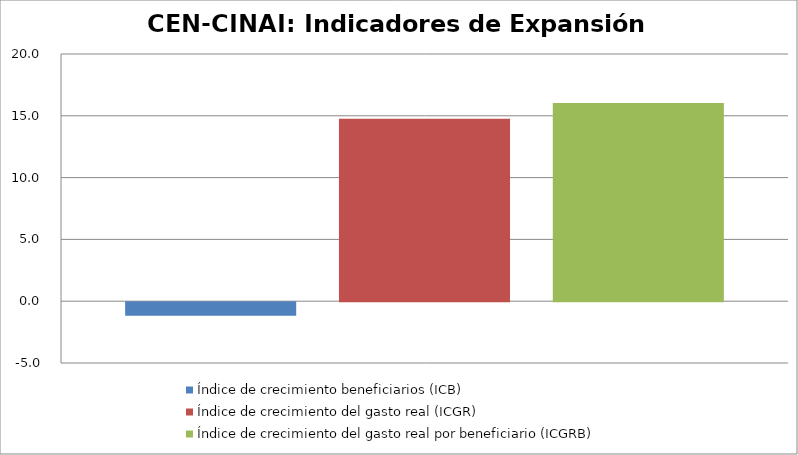
| Category | Índice de crecimiento beneficiarios (ICB)  | Índice de crecimiento del gasto real (ICGR)  | Índice de crecimiento del gasto real por beneficiario (ICGRB)  |
|---|---|---|---|
| Total | -1.091 | 14.771 | 16.037 |